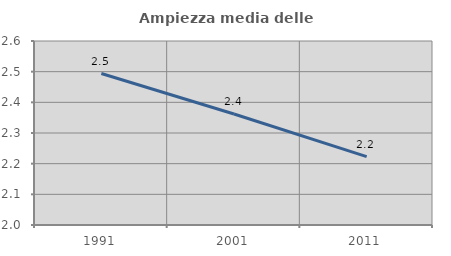
| Category | Ampiezza media delle famiglie |
|---|---|
| 1991.0 | 2.494 |
| 2001.0 | 2.362 |
| 2011.0 | 2.223 |